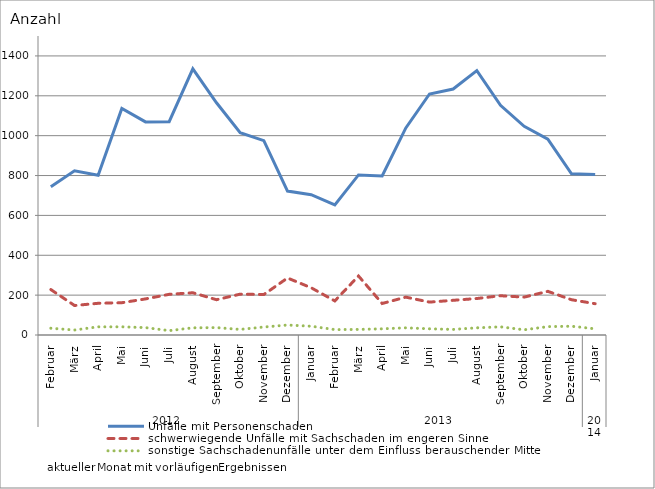
| Category | Unfälle mit Personenschaden | schwerwiegende Unfälle mit Sachschaden im engeren Sinne | sonstige Sachschadenunfälle unter dem Einfluss berauschender Mittel |
|---|---|---|---|
| 0 | 744 | 228 | 34 |
| 1 | 824 | 148 | 25 |
| 2 | 801 | 159 | 41 |
| 3 | 1136 | 162 | 41 |
| 4 | 1069 | 181 | 37 |
| 5 | 1070 | 204 | 22 |
| 6 | 1335 | 212 | 36 |
| 7 | 1165 | 177 | 37 |
| 8 | 1015 | 205 | 28 |
| 9 | 975 | 203 | 40 |
| 10 | 722 | 286 | 50 |
| 11 | 704 | 237 | 44 |
| 12 | 653 | 171 | 27 |
| 13 | 803 | 296 | 28 |
| 14 | 798 | 158 | 31 |
| 15 | 1039 | 190 | 36 |
| 16 | 1209 | 165 | 31 |
| 17 | 1234 | 174 | 28 |
| 18 | 1326 | 183 | 36 |
| 19 | 1152 | 197 | 41 |
| 20 | 1047 | 190 | 26 |
| 21 | 983 | 219 | 42 |
| 22 | 809 | 177 | 44 |
| 23 | 805 | 157 | 31 |